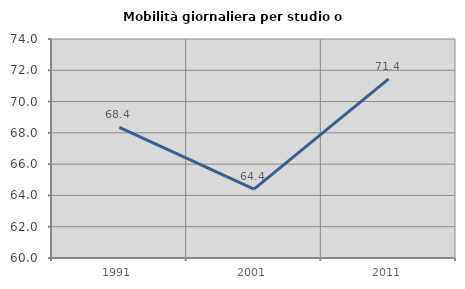
| Category | Mobilità giornaliera per studio o lavoro |
|---|---|
| 1991.0 | 68.358 |
| 2001.0 | 64.407 |
| 2011.0 | 71.45 |